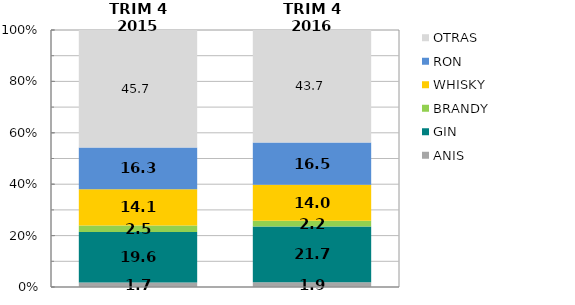
| Category | ANIS | GIN | BRANDY | WHISKY
 | RON | OTRAS |
|---|---|---|---|---|---|---|
| TRIM 4 2015 | 1.739 | 19.644 | 2.547 | 14.063 | 16.272 | 45.734 |
| TRIM 4 2016 | 1.895 | 21.688 | 2.166 | 14.001 | 16.512 | 43.737 |